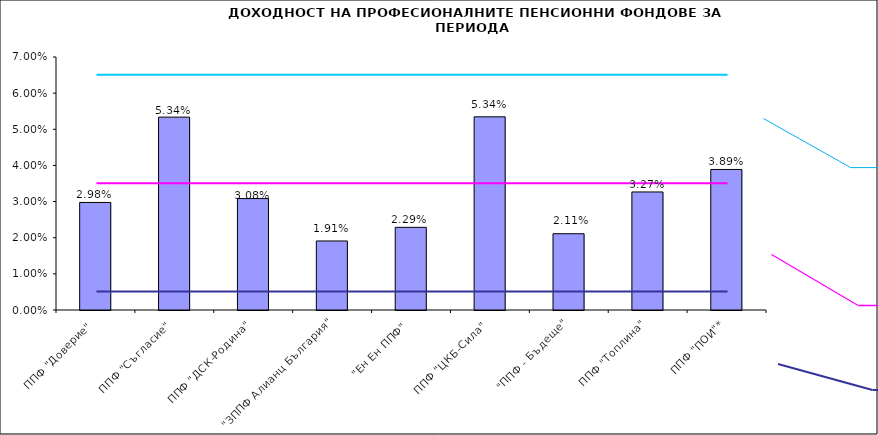
| Category | Series 0 |
|---|---|
| ППФ "Доверие"  | 0.03 |
| ППФ "Съгласие"  | 0.053 |
| ППФ "ДСК-Родина"  | 0.031 |
| "ЗППФ Алианц България"  | 0.019 |
| "Ен Ен ППФ"  | 0.023 |
| ППФ "ЦКБ-Сила"  | 0.053 |
| "ППФ - Бъдеще" | 0.021 |
| ППФ "Топлина" | 0.033 |
| ППФ "ПОИ"* | 0.039 |